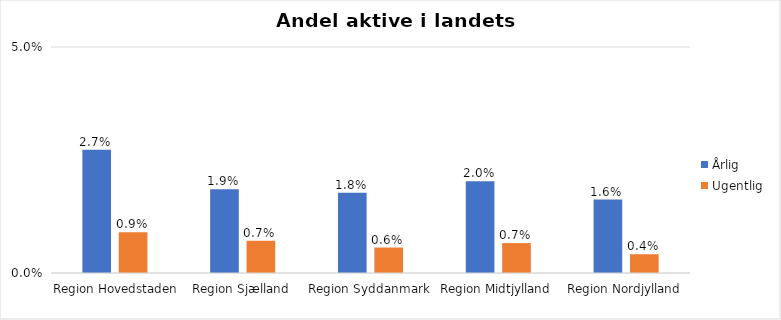
| Category | Årlig | Ugentlig |
|---|---|---|
| Region Hovedstaden | 0.027 | 0.009 |
| Region Sjælland | 0.019 | 0.007 |
| Region Syddanmark | 0.018 | 0.006 |
| Region Midtjylland | 0.02 | 0.007 |
| Region Nordjylland | 0.016 | 0.004 |